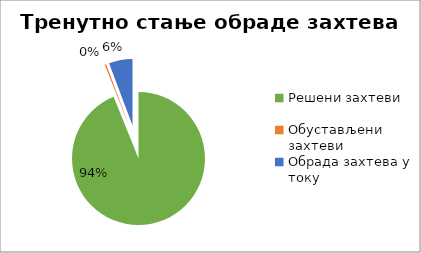
| Category | Series 0 |
|---|---|
| Решени захтеви | 50810 |
| Обустављени захтеви | 199 |
| Обрада захтева у току | 3100 |